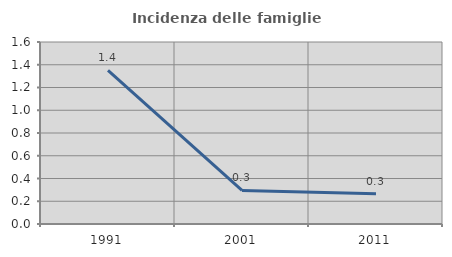
| Category | Incidenza delle famiglie numerose |
|---|---|
| 1991.0 | 1.351 |
| 2001.0 | 0.295 |
| 2011.0 | 0.265 |